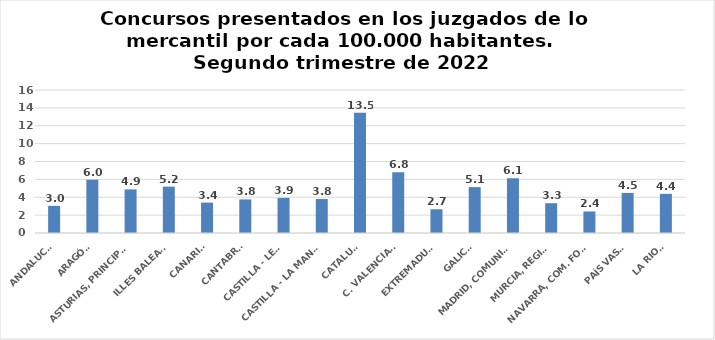
| Category | Series 0 |
|---|---|
| ANDALUCÍA | 3.036 |
| ARAGÓN | 5.961 |
| ASTURIAS, PRINCIPADO | 4.878 |
| ILLES BALEARS | 5.186 |
| CANARIAS | 3.4 |
| CANTABRIA | 3.759 |
| CASTILLA - LEÓN | 3.924 |
| CASTILLA - LA MANCHA | 3.801 |
| CATALUÑA | 13.452 |
| C. VALENCIANA | 6.797 |
| EXTREMADURA | 2.656 |
| GALICIA | 5.132 |
| MADRID, COMUNIDAD | 6.124 |
| MURCIA, REGIÓN | 3.33 |
| NAVARRA, COM. FORAL | 2.411 |
| PAÍS VASCO | 4.485 |
| LA RIOJA | 4.382 |